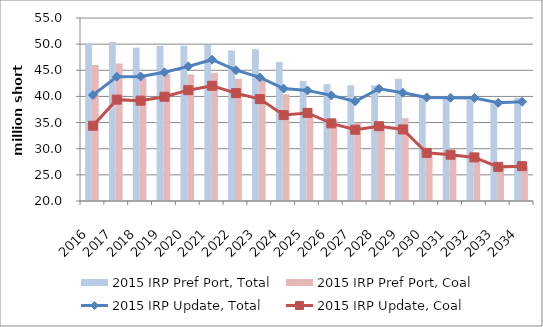
| Category | 2015 IRP Pref Port, Total | 2015 IRP Pref Port, Coal |
|---|---|---|
| 2016.0 | 50.159 | 46.034 |
| 2017.0 | 50.402 | 46.275 |
| 2018.0 | 49.33 | 44.098 |
| 2019.0 | 49.651 | 44.24 |
| 2020.0 | 49.683 | 44.203 |
| 2021.0 | 49.859 | 44.507 |
| 2022.0 | 48.765 | 43.372 |
| 2023.0 | 49.008 | 43.341 |
| 2024.0 | 46.602 | 40.427 |
| 2025.0 | 42.967 | 36.516 |
| 2026.0 | 42.35 | 35.335 |
| 2027.0 | 42.121 | 34.966 |
| 2028.0 | 42.107 | 34.633 |
| 2029.0 | 43.39 | 35.845 |
| 2030.0 | 40.13 | 29.332 |
| 2031.0 | 39.521 | 28.935 |
| 2032.0 | 39.346 | 28.34 |
| 2033.0 | 38.679 | 26.56 |
| 2034.0 | 39.75 | 26.663 |